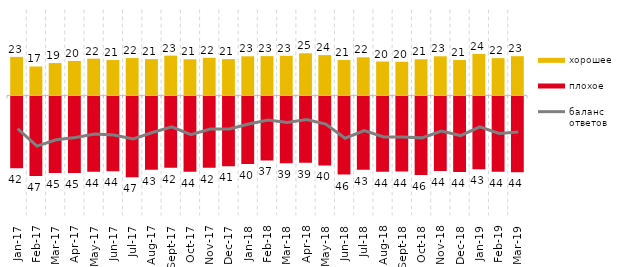
| Category | хорошее | плохое |
|---|---|---|
| 2017-01-01 | 22.55 | -42 |
| 2017-02-01 | 16.95 | -46.6 |
| 2017-03-01 | 18.95 | -44.9 |
| 2017-04-01 | 20.2 | -44.85 |
| 2017-05-01 | 21.5 | -44.1 |
| 2017-06-01 | 20.7 | -43.85 |
| 2017-07-01 | 21.85 | -47.35 |
| 2017-08-01 | 21.25 | -42.95 |
| 2017-09-01 | 23.3 | -41.7 |
| 2017-10-01 | 21.15 | -44.15 |
| 2017-11-01 | 22 | -41.7 |
| 2017-12-01 | 21.25 | -40.95 |
| 2018-01-01 | 22.9 | -39.6 |
| 2018-02-01 | 23 | -37.45 |
| 2018-03-01 | 23.2 | -39.1 |
| 2018-04-01 | 24.65 | -38.8 |
| 2018-05-01 | 23.6 | -40.4 |
| 2018-06-01 | 20.7 | -45.75 |
| 2018-07-01 | 22.3 | -42.95 |
| 2018-08-01 | 19.85 | -44.15 |
| 2018-09-01 | 19.7 | -44 |
| 2018-10-01 | 21.15 | -46 |
| 2018-11-01 | 22.904 | -43.713 |
| 2018-12-01 | 20.7 | -44.2 |
| 2019-01-01 | 24.25 | -42.65 |
| 2019-02-01 | 21.8 | -44.05 |
| 2019-03-01 | 22.974 | -44.455 |